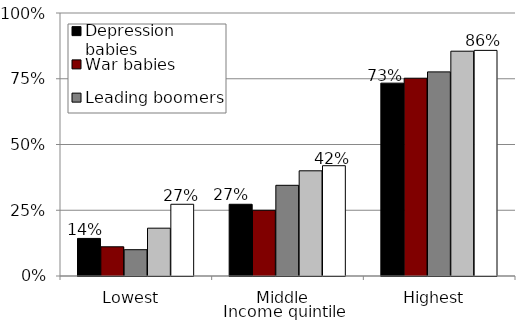
| Category | Depression babies | War babies | Leading boomers | Trailing boomers | Gen-Xers |
|---|---|---|---|---|---|
| Lowest  | 0.143 | 0.111 | 0.1 | 0.182 | 0.273 |
| Middle  | 0.273 | 0.25 | 0.345 | 0.4 | 0.419 |
| Highest  | 0.733 | 0.752 | 0.776 | 0.855 | 0.858 |